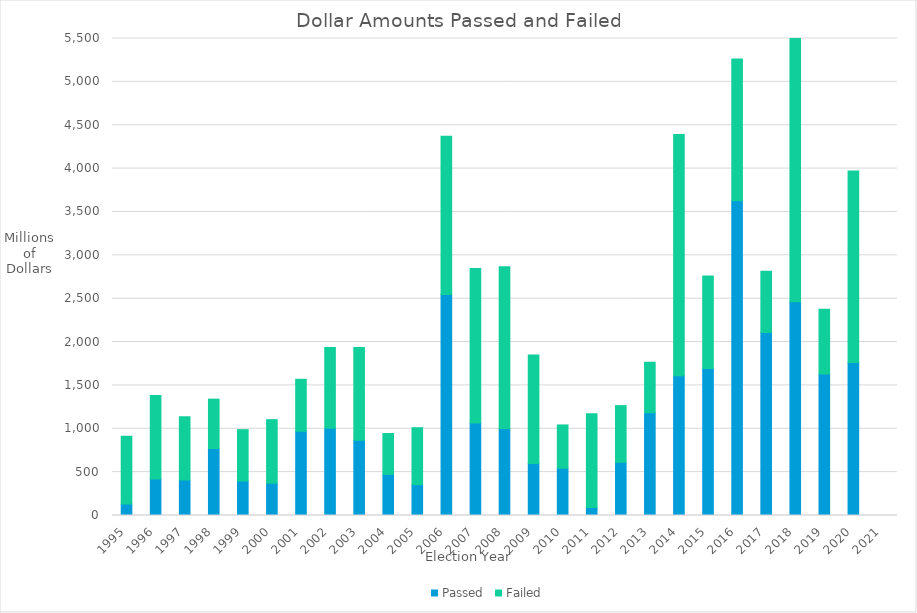
| Category | Passed | Failed |
|---|---|---|
| 1995 | 131450000 | 783561487 |
| 1996 | 421404000 | 962286422 |
| 1997 | 408240000 | 729243606 |
| 1998 | 772752508 | 568890944 |
| 1999 | 396513000 | 593285497 |
| 2000 | 372854664 | 732265400 |
| 2001 | 971542500 | 598994564 |
| 2002 | 1006632066 | 930412984 |
| 2003 | 867987062 | 1068890777 |
| 2004 | 474388785 | 471257658 |
| 2005 | 355215839 | 656797586 |
| 2006 | 2548648970 | 1823933514 |
| 2007 | 1066782891 | 1781442844 |
| 2008 | 1002122000 | 1865605845 |
| 2009 | 600896550 | 1248876038 |
| 2010 | 544995000 | 499160000 |
| 2011 | 91490000 | 1082909702 |
| 2012 | 613531500 | 653475000 |
| 2013 | 1184837000 | 582293791 |
| 2014 | 1611200000 | 2781466156 |
| 2015 | 1696275474 | 1065535121 |
| 2016 | 3627959242 | 1636352563 |
| 2017 | 2110180773 | 706239039 |
| 2018 | 2463462812 | 3322431861 |
| 2019 | 1632908000 | 745700000 |
| 2020 | 1764800000 | 2207165000 |
| 2021 | 0 | 0 |